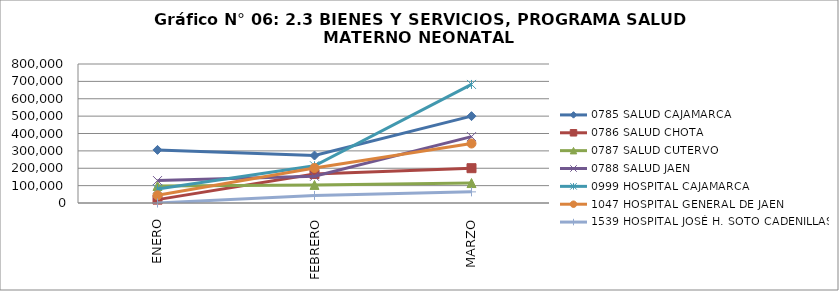
| Category | 0785 SALUD CAJAMARCA | 0786 SALUD CHOTA | 0787 SALUD CUTERVO | 0788 SALUD JAEN | 0999 HOSPITAL CAJAMARCA | 1047 HOSPITAL GENERAL DE JAEN | 1539 HOSPITAL JOSÉ H. SOTO CADENILLAS |
|---|---|---|---|---|---|---|---|
| ENERO | 305661 | 19359 | 98062 | 128989 | 80602 | 44718 | 0 |
| FEBRERO | 273342 | 166668 | 104121 | 153770 | 214117 | 201549 | 43695 |
| MARZO | 499873 | 200274 | 114914 | 382099 | 682454 | 342199 | 64082 |